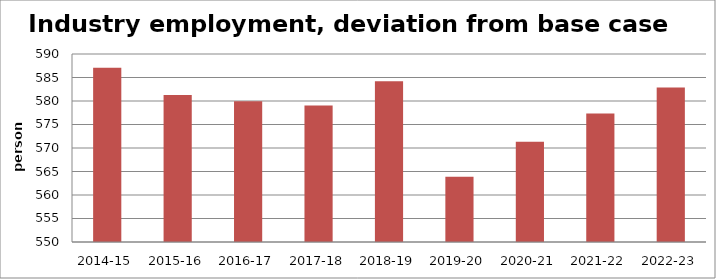
| Category | Series 0 |
|---|---|
| 2014-15 | 587.066 |
| 2015-16 | 581.292 |
| 2016-17 | 579.925 |
| 2017-18 | 579.057 |
| 2018-19 | 584.178 |
| 2019-20 | 563.902 |
| 2020-21 | 571.31 |
| 2021-22 | 577.362 |
| 2022-23 | 582.866 |